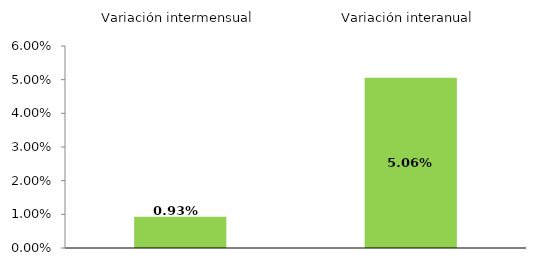
| Category | Series 0 |
|---|---|
| 0 | 0.931 |
| 1 | 5.058 |